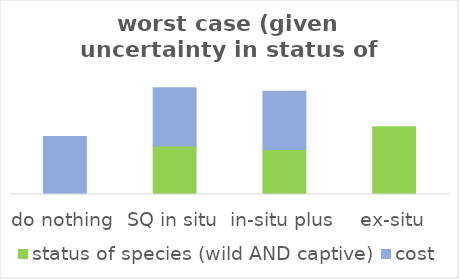
| Category | status of species (wild AND captive) | cost |
|---|---|---|
| do nothing | 0 | 0.167 |
| SQ in situ | 0.139 | 0.167 |
| in-situ plus | 0.129 | 0.167 |
| ex-situ | 0.194 | 0 |